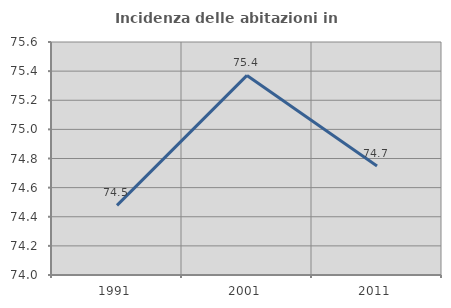
| Category | Incidenza delle abitazioni in proprietà  |
|---|---|
| 1991.0 | 74.478 |
| 2001.0 | 75.371 |
| 2011.0 | 74.748 |